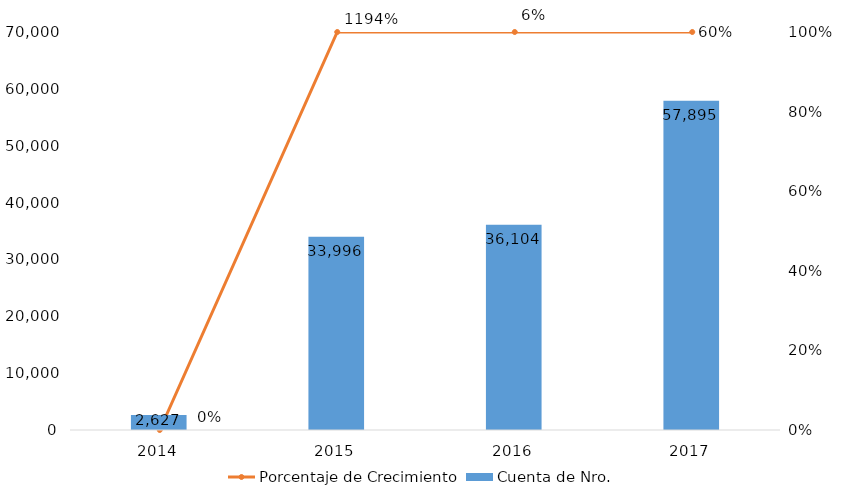
| Category | Cuenta de Nro. |
|---|---|
| 2014.0 | 2627 |
| 2015.0 | 33996 |
| 2016.0 | 36104 |
| 2017.0 | 57895 |